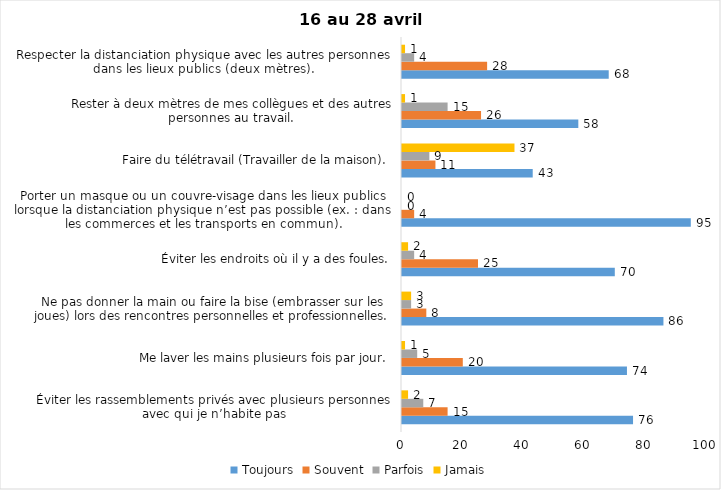
| Category | Toujours | Souvent | Parfois | Jamais |
|---|---|---|---|---|
| Éviter les rassemblements privés avec plusieurs personnes avec qui je n’habite pas | 76 | 15 | 7 | 2 |
| Me laver les mains plusieurs fois par jour. | 74 | 20 | 5 | 1 |
| Ne pas donner la main ou faire la bise (embrasser sur les joues) lors des rencontres personnelles et professionnelles. | 86 | 8 | 3 | 3 |
| Éviter les endroits où il y a des foules. | 70 | 25 | 4 | 2 |
| Porter un masque ou un couvre-visage dans les lieux publics lorsque la distanciation physique n’est pas possible (ex. : dans les commerces et les transports en commun). | 95 | 4 | 0 | 0 |
| Faire du télétravail (Travailler de la maison). | 43 | 11 | 9 | 37 |
| Rester à deux mètres de mes collègues et des autres personnes au travail. | 58 | 26 | 15 | 1 |
| Respecter la distanciation physique avec les autres personnes dans les lieux publics (deux mètres). | 68 | 28 | 4 | 1 |